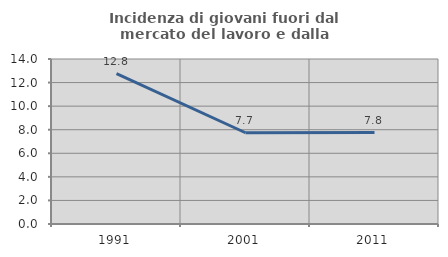
| Category | Incidenza di giovani fuori dal mercato del lavoro e dalla formazione  |
|---|---|
| 1991.0 | 12.753 |
| 2001.0 | 7.742 |
| 2011.0 | 7.753 |